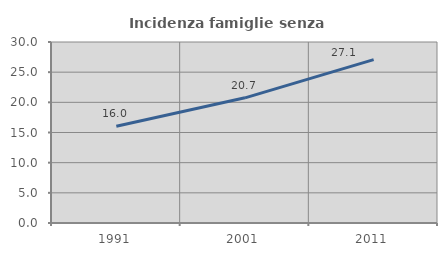
| Category | Incidenza famiglie senza nuclei |
|---|---|
| 1991.0 | 16.038 |
| 2001.0 | 20.748 |
| 2011.0 | 27.084 |